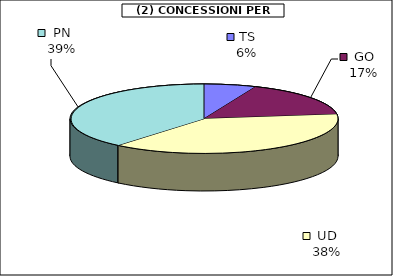
| Category | Series 0 |
|---|---|
| TS | 8080.125 |
| GO | 21399.5 |
| UD | 48912.5 |
| PN | 49952.5 |